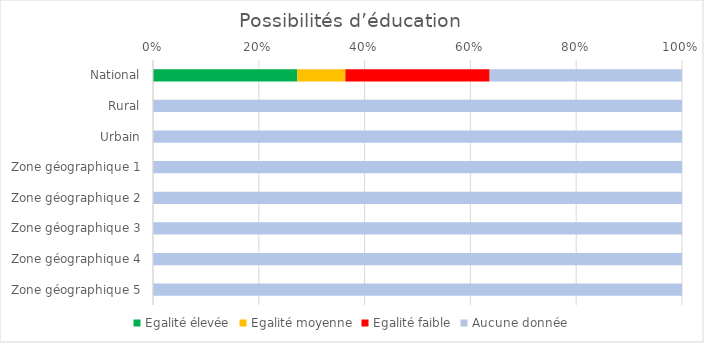
| Category | Egalité élevée | Egalité moyenne | Egalité faible | Aucune donnée |
|---|---|---|---|---|
| National | 3 | 1 | 3 | 4 |
| Rural | 0 | 0 | 0 | 11 |
| Urbain | 0 | 0 | 0 | 11 |
| Zone géographique 1 | 0 | 0 | 0 | 11 |
| Zone géographique 2 | 0 | 0 | 0 | 11 |
| Zone géographique 3 | 0 | 0 | 0 | 11 |
| Zone géographique 4 | 0 | 0 | 0 | 11 |
| Zone géographique 5 | 0 | 0 | 0 | 11 |